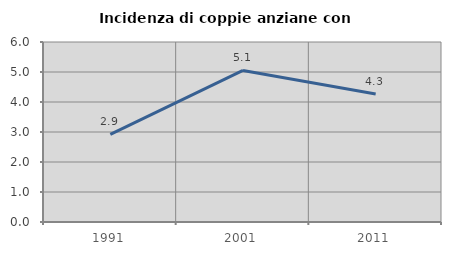
| Category | Incidenza di coppie anziane con figli |
|---|---|
| 1991.0 | 2.924 |
| 2001.0 | 5.053 |
| 2011.0 | 4.265 |